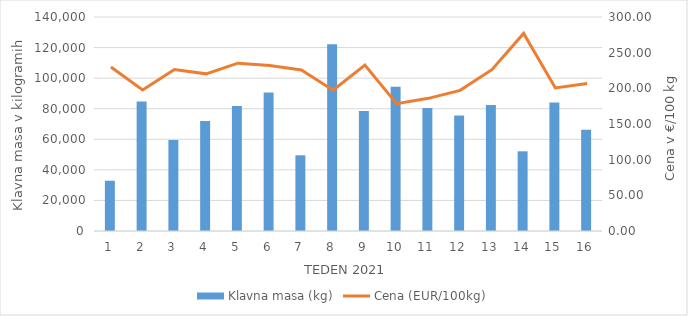
| Category | Klavna masa (kg) |
|---|---|
| 1.0 | 32871 |
| 2.0 | 84639 |
| 3.0 | 59476 |
| 4.0 | 72013 |
| 5.0 | 81759 |
| 6.0 | 90669 |
| 7.0 | 49517 |
| 8.0 | 122111 |
| 9.0 | 78545 |
| 10.0 | 94384 |
| 11.0 | 80405 |
| 12.0 | 75534 |
| 13.0 | 82440 |
| 14.0 | 52143 |
| 15.0 | 84105 |
| 16.0 | 66298 |